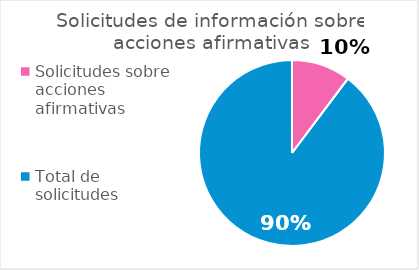
| Category | Series 0 |
|---|---|
| Solicitudes sobre acciones afirmativas | 4 |
| Total de solicitudes | 35 |